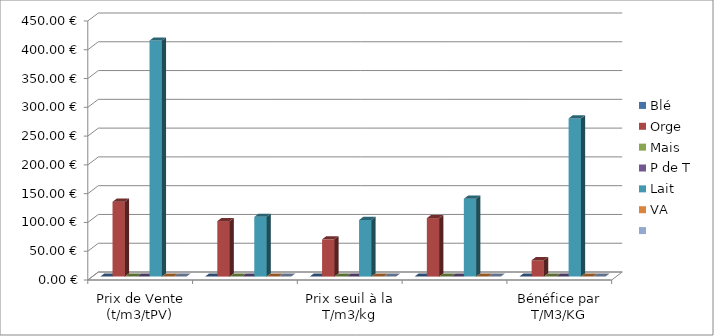
| Category | Blé  | Orge | Mais  | P de T  | Lait  | VA  | Series 6 |
|---|---|---|---|---|---|---|---|
| Prix de Vente (t/m3/tPV) | 0 | 130 | 0 | 0 | 410 | 0 | 0 |
| Cout de production à la T/m3/ Kg  | 0 | 96.367 | 0 | 0 | 103.806 | 0 | 0 |
| Prix seuil à la T/m3/kg | 0 | 64.701 | 0 | 0 | 98.306 | 0 | 0 |
| Prix equilibre (prorata T/m3/kg) | 0 | 101.574 | 0 | 0 | 135.179 | 0 | 0 |
| Bénéfice par T/M3/KG | 0 | 28.426 | 0 | 0 | 274.821 | 0 | 0 |